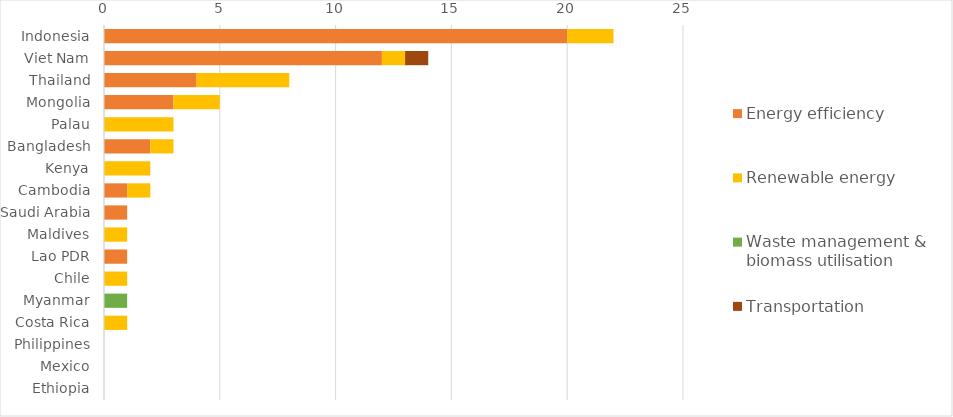
| Category | Energy efficiency | Renewable energy | Waste management & biomass utilisation | Transportation |
|---|---|---|---|---|
| Indonesia | 20 | 2 | 0 | 0 |
| Viet Nam | 12 | 1 | 0 | 1 |
| Thailand | 4 | 4 | 0 | 0 |
| Mongolia | 3 | 2 | 0 | 0 |
| Palau | 0 | 3 | 0 | 0 |
| Bangladesh | 2 | 1 | 0 | 0 |
| Kenya | 0 | 2 | 0 | 0 |
| Cambodia | 1 | 1 | 0 | 0 |
| Saudi Arabia | 1 | 0 | 0 | 0 |
| Maldives | 0 | 1 | 0 | 0 |
| Lao PDR | 1 | 0 | 0 | 0 |
| Chile | 0 | 1 | 0 | 0 |
| Myanmar | 0 | 0 | 1 | 0 |
| Costa Rica | 0 | 1 | 0 | 0 |
| Philippines | 0 | 0 | 0 | 0 |
| Mexico | 0 | 0 | 0 | 0 |
| Ethiopia | 0 | 0 | 0 | 0 |